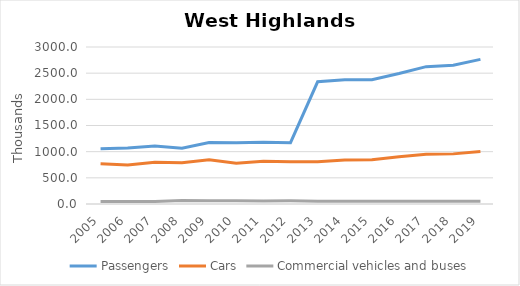
| Category | Passengers | Cars | Commercial vehicles and buses |
|---|---|---|---|
| 2005.0 | 1054.617 | 770.238 | 48.567 |
| 2006.0 | 1068.882 | 746.445 | 48.86 |
| 2007.0 | 1107.978 | 798.89 | 48.652 |
| 2008.0 | 1064.625 | 787.283 | 65.255 |
| 2009.0 | 1176.518 | 845.385 | 63.839 |
| 2010.0 | 1169.161 | 777.079 | 61.793 |
| 2011.0 | 1180.321 | 815.351 | 59.327 |
| 2012.0 | 1172.348 | 805.243 | 60.663 |
| 2013.0 | 2335.379 | 805.499 | 52.702 |
| 2014.0 | 2373 | 838.5 | 52.94 |
| 2015.0 | 2375 | 845.4 | 51.48 |
| 2016.0 | 2492.76 | 901.887 | 51.915 |
| 2017.0 | 2624.9 | 952.7 | 54.24 |
| 2018.0 | 2652.1 | 957.8 | 51.4 |
| 2019.0 | 2764 | 1003.498 | 52.014 |